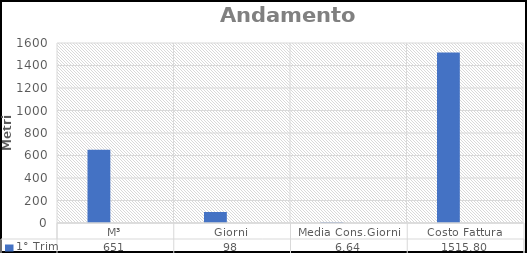
| Category | 1° Trim | Series 1 |
|---|---|---|
| M³ | 651 |  |
| Giorni | 98 |  |
| Media Cons.Giorni | 6.643 |  |
| Costo Fattura | 1515.797 |  |